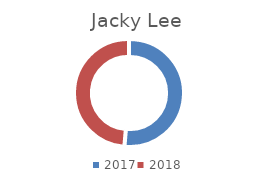
| Category | Jacky Lee |
|---|---|
| 2017.0 | 2711156 |
| 2018.0 | 2566978 |